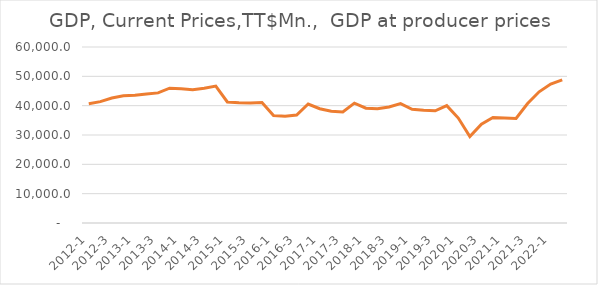
| Category | Series 1 |
|---|---|
| 2012-1 | 40682.581 |
| 2012-2 | 41381.067 |
| 2012-3 | 42606.284 |
| 2012-4 | 43372.452 |
| 2013-1 | 43530.24 |
| 2013-2 | 43999.964 |
| 2013-3 | 44352.678 |
| 2013-4 | 45945.042 |
| 2014-1 | 45729.885 |
| 2014-2 | 45424.659 |
| 2014-3 | 45920.839 |
| 2014-4 | 46679.404 |
| 2015-1 | 41269.573 |
| 2015-2 | 41007.541 |
| 2015-3 | 40885.111 |
| 2015-4 | 41077.066 |
| 2016-1 | 36669.502 |
| 2016-2 | 36373.223 |
| 2016-3 | 36798.824 |
| 2016-4 | 40558.015 |
| 2017-1 | 38949.934 |
| 2017-2 | 38066.692 |
| 2017-3 | 37875.004 |
| 2017-4 | 40866.829 |
| 2018-1 | 39130.848 |
| 2018-2 | 38915.396 |
| 2018-3 | 39541.869 |
| 2018-4 | 40681.447 |
| 2019-1 | 38782.451 |
| 2019-2 | 38425.997 |
| 2019-3 | 38256.267 |
| 2019-4 | 40012.138 |
| 2020-1 | 35772.911 |
| 2020-2 | 29452.256 |
| 2020-3 | 33700.742 |
| 2020-4 | 35955.462 |
| 2021-1 | 35785.877 |
| 2021-2 | 35667.007 |
| 2021-3 | 40744.554 |
| 2021-4 | 44723.059 |
| 2022-1 | 47354.623 |
| 2022-2 | 48786.904 |